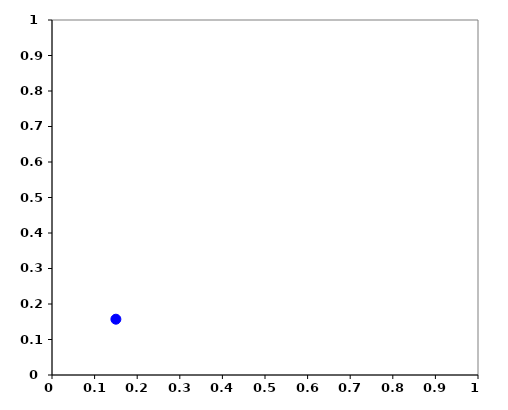
| Category | points |
|---|---|
| 0.14996600822938988 | 0.157 |